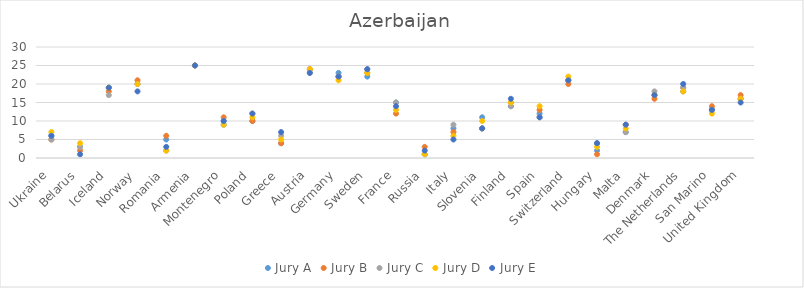
| Category | Jury A | Jury B | Jury C | Jury D | Jury E |
|---|---|---|---|---|---|
| Ukraine | 6 | 5 | 5 | 7 | 6 |
| Belarus | 3 | 2 | 3 | 4 | 1 |
| Iceland | 19 | 18 | 17 | 19 | 19 |
| Norway | 20 | 21 | 20 | 20 | 18 |
| Romania | 5 | 6 | 2 | 2 | 3 |
| Armenia | 25 | 25 | 25 | 25 | 25 |
| Montenegro | 9 | 11 | 10 | 9 | 10 |
| Poland | 10 | 10 | 12 | 11 | 12 |
| Greece | 4 | 4 | 6 | 5 | 7 |
| Austria | 24 | 24 | 23 | 24 | 23 |
| Germany | 23 | 22 | 22 | 21 | 22 |
| Sweden | 22 | 23 | 24 | 23 | 24 |
| France | 15 | 12 | 15 | 13 | 14 |
| Russia | 1 | 3 | 1 | 1 | 2 |
| Italy | 8 | 7 | 9 | 6 | 5 |
| Slovenia | 11 | 8 | 8 | 10 | 8 |
| Finland | 14 | 15 | 14 | 15 | 16 |
| Spain | 12 | 13 | 11 | 14 | 11 |
| Switzerland | 21 | 20 | 21 | 22 | 21 |
| Hungary | 2 | 1 | 4 | 3 | 4 |
| Malta | 7 | 9 | 7 | 8 | 9 |
| Denmark | 17 | 16 | 18 | 17 | 17 |
| The Netherlands | 18 | 19 | 19 | 18 | 20 |
| San Marino | 13 | 14 | 13 | 12 | 13 |
| United Kingdom | 16 | 17 | 16 | 16 | 15 |